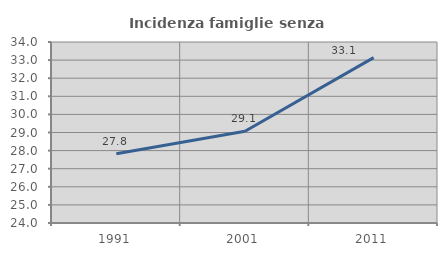
| Category | Incidenza famiglie senza nuclei |
|---|---|
| 1991.0 | 27.827 |
| 2001.0 | 29.073 |
| 2011.0 | 33.138 |